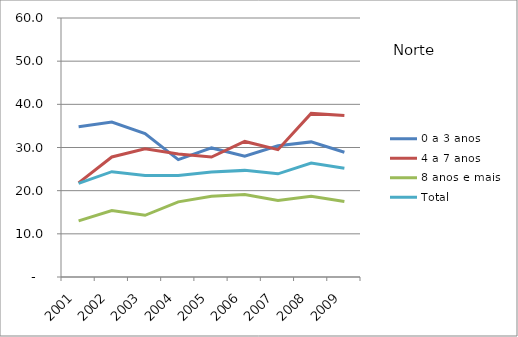
| Category | 0 a 3 anos | 4 a 7 anos | 8 anos e mais | Total |
|---|---|---|---|---|
| 2001.0 | 34.8 | 21.8 | 13 | 21.7 |
| 2002.0 | 35.9 | 27.8 | 15.4 | 24.4 |
| 2003.0 | 33.2 | 29.7 | 14.3 | 23.5 |
| 2004.0 | 27.2 | 28.5 | 17.4 | 23.5 |
| 2005.0 | 29.9 | 27.8 | 18.7 | 24.3 |
| 2006.0 | 28 | 31.4 | 19.1 | 24.7 |
| 2007.0 | 30.4 | 29.5 | 17.7 | 23.9 |
| 2008.0 | 31.3 | 37.9 | 18.7 | 26.4 |
| 2009.0 | 28.9 | 37.4 | 17.5 | 25.2 |